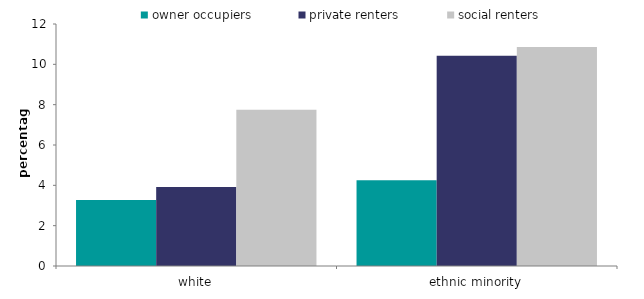
| Category | owner occupiers | private renters | social renters |
|---|---|---|---|
| white | 3.268 | 3.921 | 7.75 |
| ethnic minority | 4.255 | 10.425 | 10.861 |